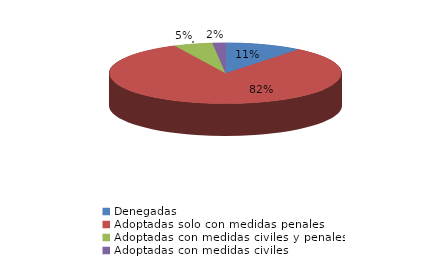
| Category | Series 0 |
|---|---|
| Denegadas | 6 |
| Adoptadas solo con medidas penales | 46 |
| Adoptadas con medidas civiles y penales | 3 |
| Adoptadas con medidas civiles | 1 |